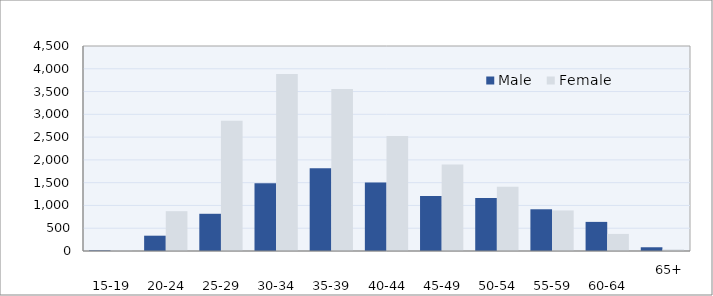
| Category | Male | Female |
|---|---|---|
|      15-19 | 12 | 12 |
|      20-24 | 336 | 874 |
|      25-29 | 817 | 2857 |
|      30-34 | 1488 | 3884 |
|      35-39 | 1814 | 3557 |
|      40-44 | 1504 | 2524 |
|      45-49 | 1206 | 1900 |
|      50-54 | 1161 | 1411 |
|      55-59 | 916 | 890 |
|      60-64 | 639 | 375 |
|      65+ | 82 | 35 |